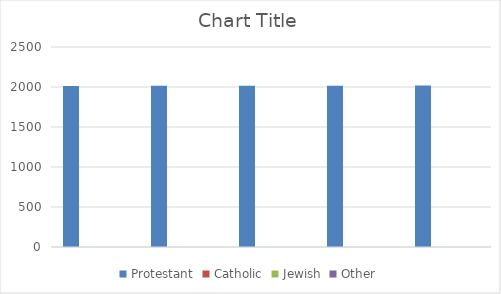
| Category | Protestant | Catholic | Jewish | Other |
|---|---|---|---|---|
|  | 2014 | 0.57 | 0.313 | 0.033 |
|  | 2015 | 0.611 | 0.318 | 0.035 |
|  | 2016 | 0.601 | 0.319 | 0.04 |
|  | 2017 | 0.622 | 0.3 | 0.031 |
|  | 2018 | 0.682 | 0.254 | 0.01 |